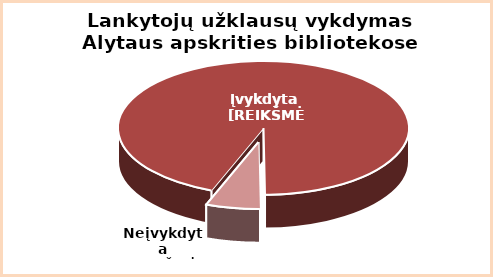
| Category | Series 0 |
|---|---|
| Įvykdyta | 0.94 |
| Neįvykdyta | 0.06 |